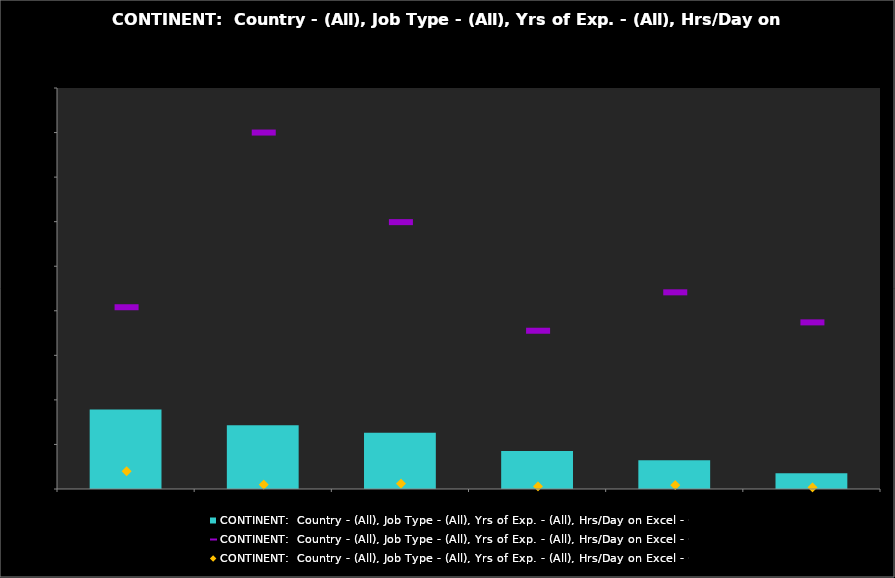
| Category | Average of Salary in USD |
|---|---|
| Oceania | 89331.056 |
| N. America | 71485.704 |
| Europe | 63119.756 |
| Africa | 42575.941 |
| S. America | 32190.335 |
| Asia | 17583.386 |